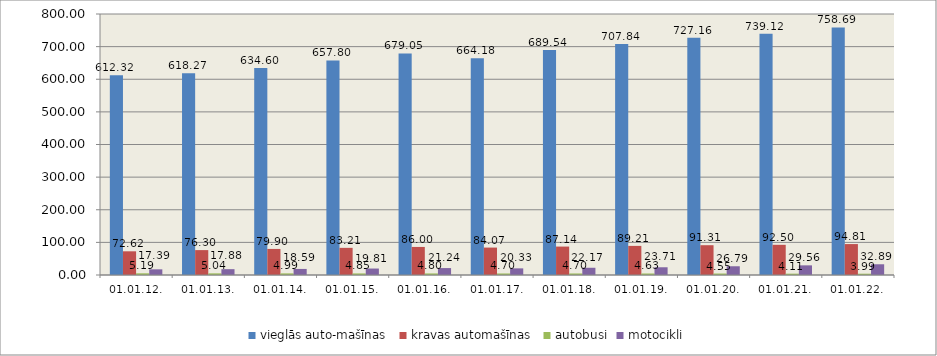
| Category | vieglās auto-mašīnas | kravas automašīnas | autobusi | motocikli |
|---|---|---|---|---|
| 01.01.12. | 612.321 | 72.622 | 5.186 | 17.385 |
| 01.01.13. | 618.274 | 76.303 | 5.044 | 17.879 |
| 01.01.14. | 634.603 | 79.899 | 4.989 | 18.587 |
| 01.01.15. | 657.799 | 83.205 | 4.845 | 19.807 |
| 01.01.16. | 679.048 | 85.998 | 4.797 | 21.241 |
| 01.01.17. | 664.177 | 84.067 | 4.696 | 20.329 |
| 01.01.18. | 689.536 | 87.143 | 4.701 | 22.166 |
| 01.01.19. | 707.841 | 89.211 | 4.632 | 23.713 |
| 01.01.20. | 727.164 | 91.311 | 4.549 | 26.785 |
| 01.01.21. | 739.124 | 92.499 | 4.105 | 29.561 |
| 01.01.22. | 758.688 | 94.811 | 3.992 | 32.893 |